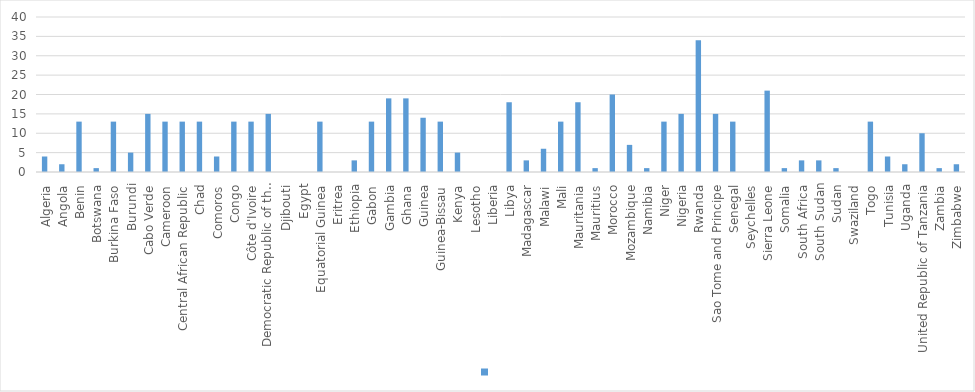
| Category | Series 0 |
|---|---|
| Algeria | 4 |
| Angola | 2 |
| Benin | 13 |
| Botswana | 1 |
| Burkina Faso | 13 |
| Burundi | 5 |
| Cabo Verde | 15 |
| Cameroon | 13 |
| Central African Republic | 13 |
| Chad | 13 |
| Comoros | 4 |
| Congo | 13 |
| Côte d'Ivoire | 13 |
| Democratic Republic of the Congo | 15 |
| Djibouti | 0 |
| Egypt | 0 |
| Equatorial Guinea | 13 |
| Eritrea | 0 |
| Ethiopia | 3 |
| Gabon | 13 |
| Gambia | 19 |
| Ghana | 19 |
| Guinea | 14 |
| Guinea-Bissau | 13 |
| Kenya | 5 |
| Lesotho | 0 |
| Liberia | 0 |
| Libya | 18 |
| Madagascar | 3 |
| Malawi | 6 |
| Mali | 13 |
| Mauritania | 18 |
| Mauritius | 1 |
| Morocco | 20 |
| Mozambique | 7 |
| Namibia | 1 |
| Niger | 13 |
| Nigeria | 15 |
| Rwanda | 34 |
| Sao Tome and Principe | 15 |
| Senegal | 13 |
| Seychelles | 0 |
| Sierra Leone | 21 |
| Somalia | 1 |
| South Africa | 3 |
| South Sudan | 3 |
| Sudan | 1 |
| Swaziland | 0 |
| Togo | 13 |
| Tunisia | 4 |
| Uganda | 2 |
| United Republic of Tanzania | 10 |
| Zambia | 1 |
| Zimbabwe | 2 |